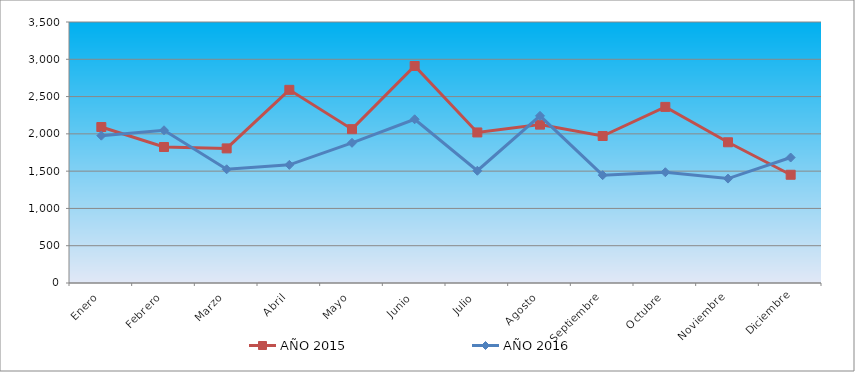
| Category | AÑO 2015 | AÑO 2016 |
|---|---|---|
| Enero | 2091.615 | 1975.865 |
| Febrero | 1823.787 | 2048.249 |
| Marzo | 1805.056 | 1524.95 |
| Abril | 2590.324 | 1584.108 |
| Mayo | 2063.069 | 1879.896 |
| Junio | 2910.159 | 2195.402 |
| Julio | 2018.86 | 1505.231 |
| Agosto | 2123.772 | 2241.414 |
| Septiembre | 1971.394 | 1446.073 |
| Octubre | 2361.597 | 1485.512 |
| Noviembre | 1887.04 | 1400.062 |
| Diciembre | 1451.46 | 1682.704 |